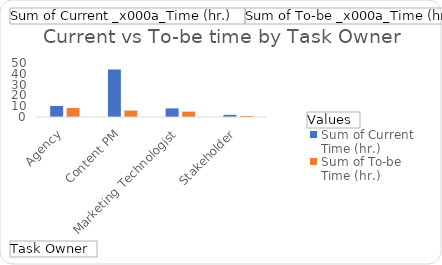
| Category | Sum of Current 
Time (hr.) | Sum of To-be 
Time (hr.) |
|---|---|---|
| Agency | 10.25 | 8.25 |
| Content PM | 44 | 6 |
| Marketing Technologist | 8 | 5 |
| Stakeholder | 2 | 1 |